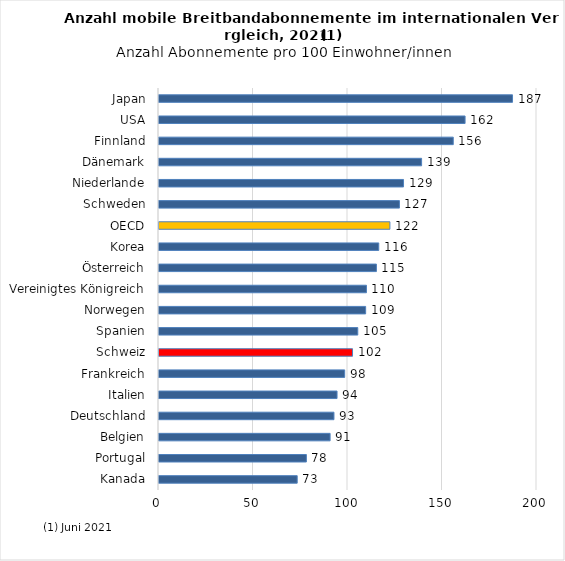
| Category | Series 0 |
|---|---|
| Kanada | 73.12 |
| Portugal | 77.98 |
| Belgien | 90.53 |
| Deutschland | 92.57 |
| Italien | 94.2 |
| Frankreich | 98.24 |
| Schweiz | 102.39 |
| Spanien | 105.17 |
| Norwegen | 109.34 |
| Vereinigtes Königreich | 109.76 |
| Österreich | 115.03 |
| Korea | 116.27 |
| OECD | 122.17 |
| Schweden | 127.21 |
| Niederlande | 129.38 |
| Dänemark | 138.94 |
| Finnland | 155.69 |
| USA | 161.94 |
| Japan | 187.05 |